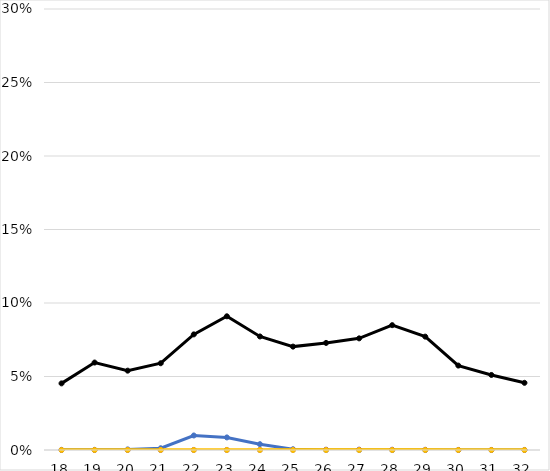
| Category | Total | miRNAs | TE | Virus |
|---|---|---|---|---|
| 18.0 | 0.045 | 0 | 0 | 0 |
| 19.0 | 0.059 | 0 | 0 | 0 |
| 20.0 | 0.054 | 0 | 0 | 0 |
| 21.0 | 0.059 | 0.001 | 0 | 0 |
| 22.0 | 0.079 | 0.01 | 0 | 0 |
| 23.0 | 0.091 | 0.009 | 0 | 0 |
| 24.0 | 0.077 | 0.004 | 0 | 0 |
| 25.0 | 0.07 | 0 | 0 | 0 |
| 26.0 | 0.073 | 0 | 0 | 0 |
| 27.0 | 0.076 | 0 | 0 | 0 |
| 28.0 | 0.085 | 0 | 0 | 0 |
| 29.0 | 0.077 | 0 | 0 | 0 |
| 30.0 | 0.057 | 0 | 0 | 0 |
| 31.0 | 0.051 | 0 | 0 | 0 |
| 32.0 | 0.046 | 0 | 0 | 0 |